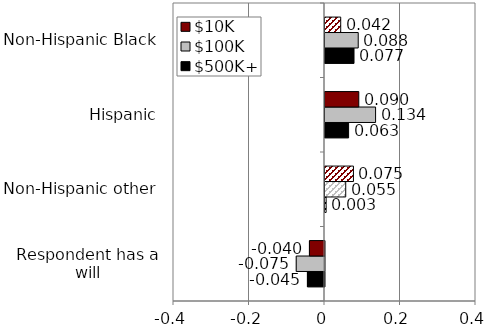
| Category | $500K+ | $100K | $10K |
|---|---|---|---|
| Respondent has a will | -0.045 | -0.075 | -0.04 |
| Non-Hispanic other | 0.003 | 0.055 | 0.075 |
| Hispanic | 0.062 | 0.134 | 0.09 |
| Non-Hispanic Black | 0.077 | 0.088 | 0.042 |